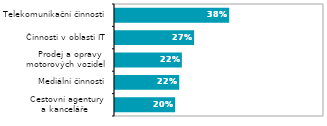
| Category | Series 0 |
|---|---|
|   Cestovní agentury 
a kanceláře | 0.201 |
| Mediální činnosti | 0.215 |
|   Prodej a opravy 
motorových vozidel  | 0.224 |
| Činnosti v oblasti IT | 0.265 |
| Telekomunikační činnosti | 0.382 |